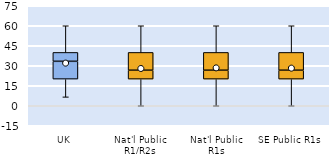
| Category | 25th | 50th | 75th |
|---|---|---|---|
| UK | 20 | 13.333 | 6.667 |
| Nat'l Public R1/R2s | 20 | 6.667 | 13.333 |
| Nat'l Public R1s | 20 | 6.667 | 13.333 |
| SE Public R1s | 20 | 6.667 | 13.333 |